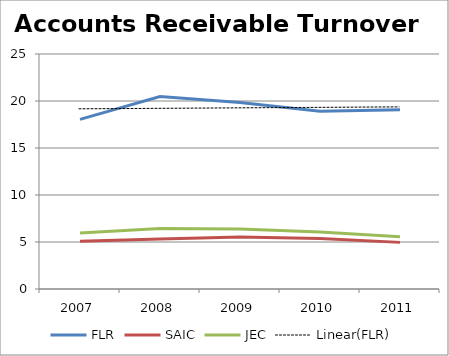
| Category | FLR | SAIC | JEC |
|---|---|---|---|
| 2007.0 | 18.04 | 5.07 | 5.97 |
| 2008.0 | 20.48 | 5.32 | 6.43 |
| 2009.0 | 19.84 | 5.52 | 6.38 |
| 2010.0 | 18.92 | 5.37 | 6.07 |
| 2011.0 | 19.08 | 4.96 | 5.57 |